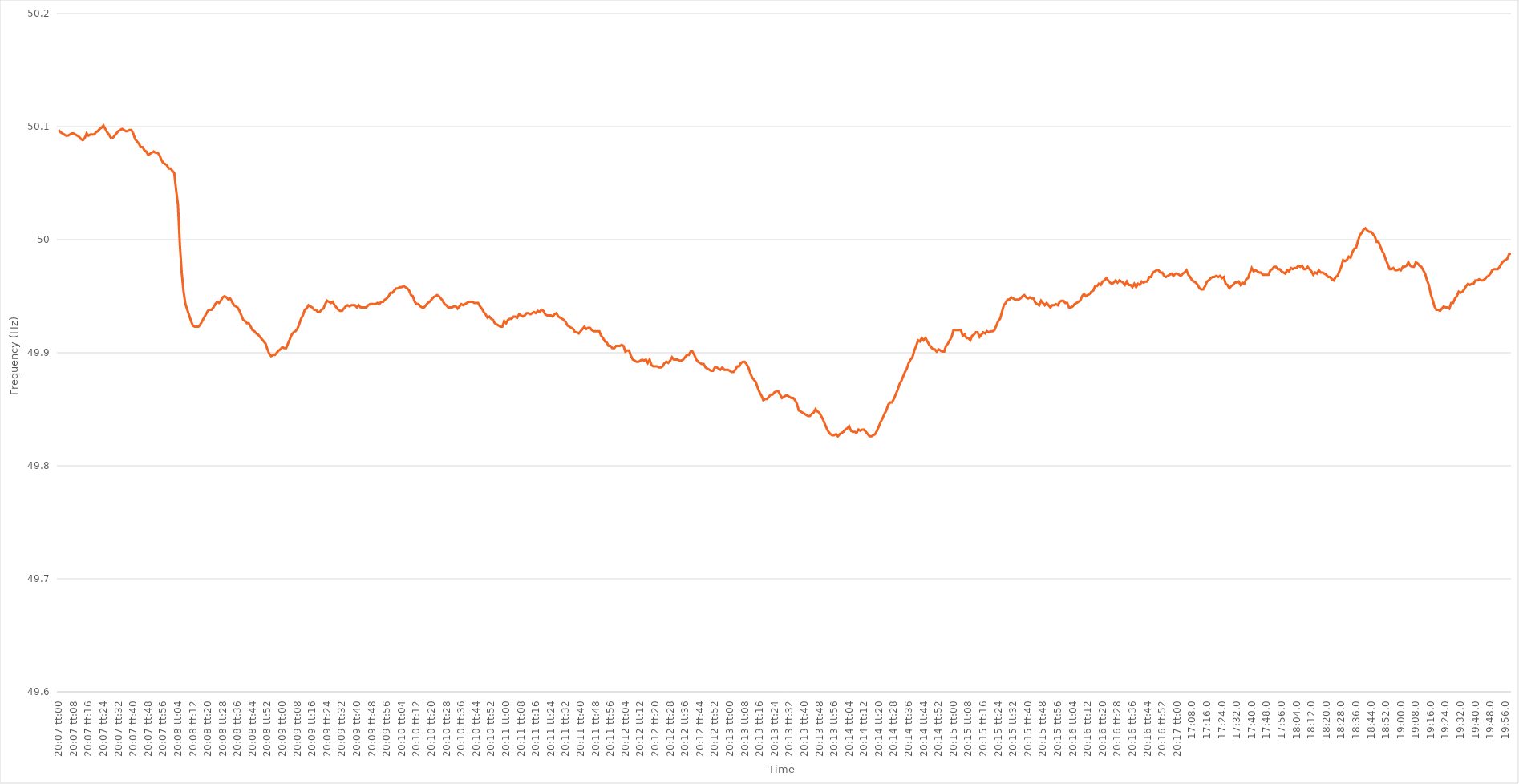
| Category | Series 0 |
|---|---|
| 0.8381944444444445 | 50.097 |
| 0.8382060185185186 | 50.095 |
| 0.8382175925925925 | 50.094 |
| 0.8382291666666667 | 50.093 |
| 0.8382407407407407 | 50.092 |
| 0.8382523148148149 | 50.092 |
| 0.8382638888888888 | 50.093 |
| 0.838275462962963 | 50.094 |
| 0.8382870370370371 | 50.094 |
| 0.8382986111111111 | 50.093 |
| 0.8383101851851852 | 50.092 |
| 0.8383217592592592 | 50.091 |
| 0.8383333333333334 | 50.089 |
| 0.8383449074074073 | 50.088 |
| 0.8383564814814815 | 50.09 |
| 0.8383680555555556 | 50.094 |
| 0.8383796296296296 | 50.092 |
| 0.8383912037037037 | 50.093 |
| 0.8384027777777777 | 50.093 |
| 0.8384143518518519 | 50.093 |
| 0.838425925925926 | 50.095 |
| 0.8384375 | 50.096 |
| 0.8384490740740741 | 50.098 |
| 0.8384606481481481 | 50.099 |
| 0.8384722222222223 | 50.101 |
| 0.8384837962962962 | 50.098 |
| 0.8384953703703704 | 50.095 |
| 0.8385069444444445 | 50.093 |
| 0.8385185185185186 | 50.09 |
| 0.8385300925925926 | 50.09 |
| 0.8385416666666666 | 50.092 |
| 0.8385532407407408 | 50.094 |
| 0.8385648148148147 | 50.096 |
| 0.8385763888888889 | 50.097 |
| 0.838587962962963 | 50.098 |
| 0.838599537037037 | 50.097 |
| 0.8386111111111111 | 50.096 |
| 0.8386226851851851 | 50.096 |
| 0.8386342592592593 | 50.097 |
| 0.8386458333333334 | 50.097 |
| 0.8386574074074074 | 50.094 |
| 0.8386689814814815 | 50.089 |
| 0.8386805555555555 | 50.087 |
| 0.8386921296296297 | 50.085 |
| 0.8387037037037036 | 50.082 |
| 0.8387152777777778 | 50.082 |
| 0.8387268518518519 | 50.079 |
| 0.838738425925926 | 50.078 |
| 0.83875 | 50.075 |
| 0.838761574074074 | 50.076 |
| 0.8387731481481482 | 50.077 |
| 0.8387847222222221 | 50.078 |
| 0.8387962962962963 | 50.077 |
| 0.8388078703703704 | 50.077 |
| 0.8388194444444445 | 50.075 |
| 0.8388310185185185 | 50.071 |
| 0.8388425925925925 | 50.068 |
| 0.8388541666666667 | 50.067 |
| 0.8388657407407408 | 50.066 |
| 0.8388773148148148 | 50.063 |
| 0.8388888888888889 | 50.063 |
| 0.838900462962963 | 50.061 |
| 0.8389120370370371 | 50.059 |
| 0.838923611111111 | 50.044 |
| 0.8389351851851852 | 50.031 |
| 0.8389467592592593 | 49.996 |
| 0.8389583333333334 | 49.971 |
| 0.8389699074074074 | 49.954 |
| 0.8389814814814814 | 49.943 |
| 0.8389930555555556 | 49.938 |
| 0.8390046296296297 | 49.933 |
| 0.8390162037037037 | 49.928 |
| 0.8390277777777778 | 49.924 |
| 0.8390393518518519 | 49.923 |
| 0.8390509259259259 | 49.923 |
| 0.8390624999999999 | 49.923 |
| 0.8390740740740741 | 49.925 |
| 0.8390856481481482 | 49.928 |
| 0.8390972222222222 | 49.931 |
| 0.8391087962962963 | 49.934 |
| 0.8391203703703703 | 49.937 |
| 0.8391319444444445 | 49.938 |
| 0.8391435185185184 | 49.938 |
| 0.8391550925925926 | 49.94 |
| 0.8391666666666667 | 49.943 |
| 0.8391782407407408 | 49.945 |
| 0.8391898148148148 | 49.944 |
| 0.8392013888888888 | 49.946 |
| 0.839212962962963 | 49.949 |
| 0.8392245370370371 | 49.95 |
| 0.8392361111111111 | 49.949 |
| 0.8392476851851852 | 49.947 |
| 0.8392592592592593 | 49.948 |
| 0.8392708333333333 | 49.945 |
| 0.8392824074074073 | 49.942 |
| 0.8392939814814815 | 49.941 |
| 0.8393055555555556 | 49.94 |
| 0.8393171296296296 | 49.937 |
| 0.8393287037037037 | 49.933 |
| 0.8393402777777778 | 49.929 |
| 0.8393518518518519 | 49.928 |
| 0.8393634259259258 | 49.926 |
| 0.839375 | 49.926 |
| 0.8393865740740741 | 49.923 |
| 0.8393981481481482 | 49.92 |
| 0.8394097222222222 | 49.919 |
| 0.8394212962962962 | 49.917 |
| 0.8394328703703704 | 49.916 |
| 0.8394444444444445 | 49.914 |
| 0.8394560185185185 | 49.912 |
| 0.8394675925925926 | 49.91 |
| 0.8394791666666667 | 49.908 |
| 0.8394907407407407 | 49.903 |
| 0.8395023148148147 | 49.899 |
| 0.8395138888888889 | 49.897 |
| 0.839525462962963 | 49.898 |
| 0.839537037037037 | 49.898 |
| 0.8395486111111111 | 49.9 |
| 0.8395601851851852 | 49.902 |
| 0.8395717592592593 | 49.903 |
| 0.8395833333333332 | 49.905 |
| 0.8395949074074074 | 49.904 |
| 0.8396064814814815 | 49.904 |
| 0.8396180555555556 | 49.908 |
| 0.8396296296296296 | 49.912 |
| 0.8396412037037037 | 49.916 |
| 0.8396527777777778 | 49.918 |
| 0.839664351851852 | 49.919 |
| 0.8396759259259259 | 49.921 |
| 0.8396875 | 49.925 |
| 0.8396990740740741 | 49.93 |
| 0.8397106481481482 | 49.933 |
| 0.8397222222222221 | 49.938 |
| 0.8397337962962963 | 49.939 |
| 0.8397453703703704 | 49.942 |
| 0.8397569444444444 | 49.941 |
| 0.8397685185185185 | 49.94 |
| 0.8397800925925926 | 49.938 |
| 0.8397916666666667 | 49.938 |
| 0.8398032407407406 | 49.936 |
| 0.8398148148148148 | 49.936 |
| 0.8398263888888889 | 49.938 |
| 0.839837962962963 | 49.939 |
| 0.839849537037037 | 49.943 |
| 0.8398611111111111 | 49.946 |
| 0.8398726851851852 | 49.945 |
| 0.8398842592592594 | 49.944 |
| 0.8398958333333333 | 49.945 |
| 0.8399074074074074 | 49.942 |
| 0.8399189814814815 | 49.94 |
| 0.8399305555555556 | 49.938 |
| 0.8399421296296296 | 49.937 |
| 0.8399537037037037 | 49.937 |
| 0.8399652777777779 | 49.939 |
| 0.8399768518518518 | 49.941 |
| 0.8399884259259259 | 49.942 |
| 0.84 | 49.941 |
| 0.8400115740740741 | 49.942 |
| 0.840023148148148 | 49.942 |
| 0.8400347222222222 | 49.942 |
| 0.8400462962962963 | 49.94 |
| 0.8400578703703704 | 49.942 |
| 0.8400694444444444 | 49.94 |
| 0.8400810185185185 | 49.94 |
| 0.8400925925925926 | 49.94 |
| 0.8401041666666668 | 49.94 |
| 0.8401157407407407 | 49.942 |
| 0.8401273148148148 | 49.943 |
| 0.8401388888888889 | 49.943 |
| 0.840150462962963 | 49.943 |
| 0.840162037037037 | 49.943 |
| 0.8401736111111111 | 49.944 |
| 0.8401851851851853 | 49.943 |
| 0.8401967592592593 | 49.945 |
| 0.8402083333333333 | 49.945 |
| 0.8402199074074074 | 49.947 |
| 0.8402314814814815 | 49.948 |
| 0.8402430555555555 | 49.95 |
| 0.8402546296296296 | 49.953 |
| 0.8402662037037038 | 49.953 |
| 0.8402777777777778 | 49.955 |
| 0.8402893518518518 | 49.957 |
| 0.8403009259259259 | 49.957 |
| 0.8403125 | 49.958 |
| 0.8403240740740742 | 49.958 |
| 0.8403356481481481 | 49.959 |
| 0.8403472222222222 | 49.958 |
| 0.8403587962962963 | 49.957 |
| 0.8403703703703704 | 49.955 |
| 0.8403819444444444 | 49.951 |
| 0.8403935185185185 | 49.95 |
| 0.8404050925925927 | 49.945 |
| 0.8404166666666667 | 49.943 |
| 0.8404282407407407 | 49.943 |
| 0.8404398148148148 | 49.941 |
| 0.8404513888888889 | 49.94 |
| 0.8404629629629629 | 49.94 |
| 0.840474537037037 | 49.942 |
| 0.8404861111111112 | 49.944 |
| 0.8404976851851852 | 49.945 |
| 0.8405092592592592 | 49.947 |
| 0.8405208333333333 | 49.949 |
| 0.8405324074074074 | 49.95 |
| 0.8405439814814816 | 49.951 |
| 0.8405555555555555 | 49.95 |
| 0.8405671296296297 | 49.948 |
| 0.8405787037037037 | 49.946 |
| 0.8405902777777778 | 49.943 |
| 0.8406018518518518 | 49.942 |
| 0.8406134259259259 | 49.94 |
| 0.8406250000000001 | 49.94 |
| 0.8406365740740741 | 49.94 |
| 0.8406481481481481 | 49.941 |
| 0.8406597222222222 | 49.941 |
| 0.8406712962962963 | 49.939 |
| 0.8406828703703703 | 49.941 |
| 0.8406944444444444 | 49.943 |
| 0.8407060185185186 | 49.942 |
| 0.8407175925925926 | 49.943 |
| 0.8407291666666666 | 49.944 |
| 0.8407407407407407 | 49.945 |
| 0.8407523148148148 | 49.945 |
| 0.840763888888889 | 49.945 |
| 0.8407754629629629 | 49.944 |
| 0.840787037037037 | 49.944 |
| 0.8407986111111111 | 49.944 |
| 0.8408101851851852 | 49.941 |
| 0.8408217592592592 | 49.939 |
| 0.8408333333333333 | 49.936 |
| 0.8408449074074075 | 49.934 |
| 0.8408564814814815 | 49.931 |
| 0.8408680555555555 | 49.932 |
| 0.8408796296296296 | 49.93 |
| 0.8408912037037037 | 49.929 |
| 0.8409027777777779 | 49.926 |
| 0.8409143518518518 | 49.925 |
| 0.840925925925926 | 49.924 |
| 0.8409375 | 49.923 |
| 0.840949074074074 | 49.923 |
| 0.8409606481481481 | 49.928 |
| 0.8409722222222222 | 49.926 |
| 0.8409837962962964 | 49.929 |
| 0.8409953703703703 | 49.93 |
| 0.8410069444444445 | 49.93 |
| 0.8410185185185185 | 49.932 |
| 0.8410300925925926 | 49.932 |
| 0.8410416666666666 | 49.931 |
| 0.8410532407407407 | 49.934 |
| 0.8410648148148149 | 49.933 |
| 0.8410763888888889 | 49.932 |
| 0.841087962962963 | 49.933 |
| 0.841099537037037 | 49.935 |
| 0.8411111111111111 | 49.935 |
| 0.8411226851851853 | 49.934 |
| 0.8411342592592592 | 49.935 |
| 0.8411458333333334 | 49.936 |
| 0.8411574074074074 | 49.935 |
| 0.8411689814814814 | 49.937 |
| 0.8411805555555555 | 49.936 |
| 0.8411921296296296 | 49.938 |
| 0.8412037037037038 | 49.937 |
| 0.8412152777777777 | 49.934 |
| 0.8412268518518519 | 49.933 |
| 0.8412384259259259 | 49.933 |
| 0.84125 | 49.933 |
| 0.841261574074074 | 49.932 |
| 0.8412731481481481 | 49.934 |
| 0.8412847222222223 | 49.935 |
| 0.8412962962962963 | 49.932 |
| 0.8413078703703704 | 49.931 |
| 0.8413194444444444 | 49.93 |
| 0.8413310185185185 | 49.929 |
| 0.8413425925925927 | 49.927 |
| 0.8413541666666666 | 49.924 |
| 0.8413657407407408 | 49.923 |
| 0.8413773148148148 | 49.922 |
| 0.8413888888888889 | 49.921 |
| 0.8414004629629629 | 49.918 |
| 0.841412037037037 | 49.918 |
| 0.8414236111111112 | 49.917 |
| 0.8414351851851851 | 49.919 |
| 0.8414467592592593 | 49.921 |
| 0.8414583333333333 | 49.923 |
| 0.8414699074074075 | 49.921 |
| 0.8414814814814814 | 49.922 |
| 0.8414930555555555 | 49.922 |
| 0.8415046296296297 | 49.92 |
| 0.8415162037037037 | 49.919 |
| 0.8415277777777778 | 49.919 |
| 0.8415393518518518 | 49.919 |
| 0.841550925925926 | 49.919 |
| 0.8415625000000001 | 49.915 |
| 0.841574074074074 | 49.913 |
| 0.8415856481481482 | 49.91 |
| 0.8415972222222222 | 49.909 |
| 0.8416087962962964 | 49.906 |
| 0.8416203703703703 | 49.906 |
| 0.8416319444444444 | 49.904 |
| 0.8416435185185186 | 49.904 |
| 0.8416550925925925 | 49.906 |
| 0.8416666666666667 | 49.906 |
| 0.8416782407407407 | 49.906 |
| 0.8416898148148149 | 49.907 |
| 0.8417013888888888 | 49.906 |
| 0.8417129629629629 | 49.901 |
| 0.8417245370370371 | 49.902 |
| 0.8417361111111111 | 49.902 |
| 0.8417476851851852 | 49.897 |
| 0.8417592592592592 | 49.894 |
| 0.8417708333333334 | 49.893 |
| 0.8417824074074075 | 49.892 |
| 0.8417939814814814 | 49.892 |
| 0.8418055555555556 | 49.893 |
| 0.8418171296296296 | 49.894 |
| 0.8418287037037038 | 49.893 |
| 0.8418402777777777 | 49.894 |
| 0.8418518518518519 | 49.891 |
| 0.841863425925926 | 49.894 |
| 0.8418749999999999 | 49.889 |
| 0.8418865740740741 | 49.888 |
| 0.8418981481481481 | 49.888 |
| 0.8419097222222223 | 49.888 |
| 0.8419212962962962 | 49.887 |
| 0.8419328703703703 | 49.887 |
| 0.8419444444444445 | 49.888 |
| 0.8419560185185185 | 49.891 |
| 0.8419675925925926 | 49.892 |
| 0.8419791666666666 | 49.891 |
| 0.8419907407407408 | 49.893 |
| 0.8420023148148149 | 49.896 |
| 0.8420138888888888 | 49.894 |
| 0.842025462962963 | 49.894 |
| 0.842037037037037 | 49.894 |
| 0.8420486111111112 | 49.893 |
| 0.8420601851851851 | 49.893 |
| 0.8420717592592593 | 49.894 |
| 0.8420833333333334 | 49.896 |
| 0.8420949074074073 | 49.898 |
| 0.8421064814814815 | 49.898 |
| 0.8421180555555555 | 49.901 |
| 0.8421296296296297 | 49.901 |
| 0.8421412037037036 | 49.898 |
| 0.8421527777777778 | 49.894 |
| 0.8421643518518519 | 49.892 |
| 0.8421759259259259 | 49.891 |
| 0.8421875 | 49.89 |
| 0.842199074074074 | 49.89 |
| 0.8422106481481482 | 49.887 |
| 0.8422222222222223 | 49.886 |
| 0.8422337962962962 | 49.885 |
| 0.8422453703703704 | 49.884 |
| 0.8422569444444444 | 49.884 |
| 0.8422685185185186 | 49.887 |
| 0.8422800925925925 | 49.887 |
| 0.8422916666666667 | 49.886 |
| 0.8423032407407408 | 49.885 |
| 0.8423148148148148 | 49.887 |
| 0.8423263888888889 | 49.885 |
| 0.8423379629629629 | 49.885 |
| 0.8423495370370371 | 49.885 |
| 0.842361111111111 | 49.884 |
| 0.8423726851851852 | 49.883 |
| 0.8423842592592593 | 49.883 |
| 0.8423958333333333 | 49.885 |
| 0.8424074074074074 | 49.888 |
| 0.8424189814814814 | 49.888 |
| 0.8424305555555556 | 49.891 |
| 0.8424421296296297 | 49.892 |
| 0.8424537037037036 | 49.892 |
| 0.8424652777777778 | 49.89 |
| 0.8424768518518518 | 49.887 |
| 0.842488425925926 | 49.882 |
| 0.8424999999999999 | 49.878 |
| 0.8425115740740741 | 49.876 |
| 0.8425231481481482 | 49.874 |
| 0.8425347222222223 | 49.869 |
| 0.8425462962962963 | 49.865 |
| 0.8425578703703703 | 49.862 |
| 0.8425694444444445 | 49.858 |
| 0.8425810185185184 | 49.859 |
| 0.8425925925925926 | 49.859 |
| 0.8426041666666667 | 49.861 |
| 0.8426157407407407 | 49.863 |
| 0.8426273148148148 | 49.863 |
| 0.8426388888888888 | 49.865 |
| 0.842650462962963 | 49.866 |
| 0.8426620370370371 | 49.866 |
| 0.842673611111111 | 49.863 |
| 0.8426851851851852 | 49.86 |
| 0.8426967592592592 | 49.861 |
| 0.8427083333333334 | 49.862 |
| 0.8427199074074073 | 49.862 |
| 0.8427314814814815 | 49.861 |
| 0.8427430555555556 | 49.86 |
| 0.8427546296296297 | 49.86 |
| 0.8427662037037037 | 49.858 |
| 0.8427777777777777 | 49.855 |
| 0.8427893518518519 | 49.849 |
| 0.842800925925926 | 49.848 |
| 0.8428125 | 49.847 |
| 0.8428240740740741 | 49.846 |
| 0.8428356481481482 | 49.845 |
| 0.8428472222222222 | 49.844 |
| 0.8428587962962962 | 49.844 |
| 0.8428703703703704 | 49.846 |
| 0.8428819444444445 | 49.847 |
| 0.8428935185185185 | 49.85 |
| 0.8429050925925926 | 49.848 |
| 0.8429166666666666 | 49.847 |
| 0.8429282407407408 | 49.844 |
| 0.8429398148148147 | 49.841 |
| 0.8429513888888889 | 49.837 |
| 0.842962962962963 | 49.833 |
| 0.8429745370370371 | 49.83 |
| 0.8429861111111111 | 49.828 |
| 0.8429976851851851 | 49.827 |
| 0.8430092592592593 | 49.827 |
| 0.8430208333333334 | 49.828 |
| 0.8430324074074074 | 49.826 |
| 0.8430439814814815 | 49.828 |
| 0.8430555555555556 | 49.829 |
| 0.8430671296296296 | 49.83 |
| 0.8430787037037036 | 49.832 |
| 0.8430902777777778 | 49.833 |
| 0.8431018518518519 | 49.835 |
| 0.8431134259259259 | 49.831 |
| 0.843125 | 49.83 |
| 0.843136574074074 | 49.83 |
| 0.8431481481481482 | 49.829 |
| 0.8431597222222221 | 49.832 |
| 0.8431712962962963 | 49.831 |
| 0.8431828703703704 | 49.832 |
| 0.8431944444444445 | 49.832 |
| 0.8432060185185185 | 49.83 |
| 0.8432175925925925 | 49.828 |
| 0.8432291666666667 | 49.826 |
| 0.8432407407407408 | 49.826 |
| 0.8432523148148148 | 49.827 |
| 0.8432638888888889 | 49.828 |
| 0.843275462962963 | 49.831 |
| 0.843287037037037 | 49.835 |
| 0.843298611111111 | 49.839 |
| 0.8433101851851852 | 49.842 |
| 0.8433217592592593 | 49.846 |
| 0.8433333333333333 | 49.849 |
| 0.8433449074074074 | 49.854 |
| 0.8433564814814815 | 49.856 |
| 0.8433680555555556 | 49.856 |
| 0.8433796296296295 | 49.859 |
| 0.8433912037037037 | 49.863 |
| 0.8434027777777778 | 49.867 |
| 0.8434143518518519 | 49.872 |
| 0.8434259259259259 | 49.875 |
| 0.8434375 | 49.879 |
| 0.8434490740740741 | 49.883 |
| 0.8434606481481483 | 49.886 |
| 0.8434722222222222 | 49.891 |
| 0.8434837962962963 | 49.894 |
| 0.8434953703703704 | 49.896 |
| 0.8435069444444445 | 49.902 |
| 0.8435185185185184 | 49.906 |
| 0.8435300925925926 | 49.911 |
| 0.8435416666666667 | 49.91 |
| 0.8435532407407407 | 49.913 |
| 0.8435648148148148 | 49.911 |
| 0.8435763888888889 | 49.913 |
| 0.843587962962963 | 49.91 |
| 0.8435995370370369 | 49.907 |
| 0.8436111111111111 | 49.905 |
| 0.8436226851851852 | 49.903 |
| 0.8436342592592593 | 49.903 |
| 0.8436458333333333 | 49.901 |
| 0.8436574074074074 | 49.903 |
| 0.8436689814814815 | 49.902 |
| 0.8436805555555557 | 49.901 |
| 0.8436921296296296 | 49.901 |
| 0.8437037037037037 | 49.906 |
| 0.8437152777777778 | 49.908 |
| 0.8437268518518519 | 49.911 |
| 0.8437384259259259 | 49.914 |
| 0.84375 | 49.92 |
| 0.8437615740740741 | 49.92 |
| 0.8437731481481481 | 49.92 |
| 0.8437847222222222 | 49.92 |
| 0.8437962962962963 | 49.92 |
| 0.8438078703703704 | 49.915 |
| 0.8438194444444443 | 49.916 |
| 0.8438310185185185 | 49.913 |
| 0.8438425925925926 | 49.913 |
| 0.8438541666666667 | 49.911 |
| 0.8438657407407407 | 49.915 |
| 0.8438773148148148 | 49.916 |
| 0.8438888888888889 | 49.918 |
| 0.8439004629629631 | 49.918 |
| 0.843912037037037 | 49.914 |
| 0.8439236111111111 | 49.916 |
| 0.8439351851851852 | 49.918 |
| 0.8439467592592593 | 49.917 |
| 0.8439583333333333 | 49.919 |
| 0.8439699074074074 | 49.918 |
| 0.8439814814814816 | 49.919 |
| 0.8439930555555555 | 49.919 |
| 0.8440046296296296 | 49.92 |
| 0.8440162037037037 | 49.924 |
| 0.8440277777777778 | 49.928 |
| 0.8440393518518517 | 49.93 |
| 0.8440509259259259 | 49.936 |
| 0.8440625 | 49.942 |
| 0.8440740740740741 | 49.944 |
| 0.8440856481481481 | 49.947 |
| 0.8440972222222222 | 49.947 |
| 0.8441087962962963 | 49.949 |
| 0.8441203703703705 | 49.948 |
| 0.8441319444444444 | 49.947 |
| 0.8441435185185185 | 49.947 |
| 0.8441550925925926 | 49.947 |
| 0.8441666666666667 | 49.948 |
| 0.8441782407407407 | 49.95 |
| 0.8441898148148148 | 49.951 |
| 0.844201388888889 | 49.949 |
| 0.844212962962963 | 49.948 |
| 0.844224537037037 | 49.949 |
| 0.8442361111111111 | 49.948 |
| 0.8442476851851852 | 49.948 |
| 0.8442592592592592 | 49.944 |
| 0.8442708333333333 | 49.943 |
| 0.8442824074074075 | 49.942 |
| 0.8442939814814815 | 49.946 |
| 0.8443055555555555 | 49.944 |
| 0.8443171296296296 | 49.942 |
| 0.8443287037037037 | 49.944 |
| 0.8443402777777779 | 49.942 |
| 0.8443518518518518 | 49.94 |
| 0.844363425925926 | 49.942 |
| 0.844375 | 49.942 |
| 0.8443865740740741 | 49.943 |
| 0.8443981481481481 | 49.942 |
| 0.8444097222222222 | 49.945 |
| 0.8444212962962964 | 49.946 |
| 0.8444328703703704 | 49.946 |
| 0.8444444444444444 | 49.944 |
| 0.8444560185185185 | 49.944 |
| 0.8444675925925926 | 49.94 |
| 0.8444791666666666 | 49.94 |
| 0.8444907407407407 | 49.941 |
| 0.8445023148148149 | 49.943 |
| 0.8445138888888889 | 49.944 |
| 0.8445254629629629 | 49.945 |
| 0.844537037037037 | 49.946 |
| 0.8445486111111111 | 49.95 |
| 0.8445601851851853 | 49.952 |
| 0.8445717592592592 | 49.95 |
| 0.8445833333333334 | 49.951 |
| 0.8445949074074074 | 49.952 |
| 0.8446064814814815 | 49.954 |
| 0.8446180555555555 | 49.955 |
| 0.8446296296296296 | 49.959 |
| 0.8446412037037038 | 49.959 |
| 0.8446527777777778 | 49.961 |
| 0.8446643518518518 | 49.96 |
| 0.8446759259259259 | 49.963 |
| 0.8446875 | 49.964 |
| 0.844699074074074 | 49.966 |
| 0.8447106481481481 | 49.964 |
| 0.8447222222222223 | 49.962 |
| 0.8447337962962963 | 49.961 |
| 0.8447453703703703 | 49.962 |
| 0.8447569444444444 | 49.964 |
| 0.8447685185185185 | 49.962 |
| 0.8447800925925927 | 49.964 |
| 0.8447916666666666 | 49.963 |
| 0.8448032407407408 | 49.962 |
| 0.8448148148148148 | 49.96 |
| 0.844826388888889 | 49.963 |
| 0.8448379629629629 | 49.96 |
| 0.844849537037037 | 49.96 |
| 0.8448611111111112 | 49.958 |
| 0.8448726851851852 | 49.961 |
| 0.8448842592592593 | 49.958 |
| 0.8448958333333333 | 49.961 |
| 0.8449074074074074 | 49.96 |
| 0.8449189814814816 | 49.963 |
| 0.8449305555555555 | 49.962 |
| 0.8449421296296297 | 49.963 |
| 0.8449537037037037 | 49.963 |
| 0.8449652777777777 | 49.967 |
| 0.8449768518518518 | 49.967 |
| 0.8449884259259259 | 49.971 |
| 0.8450000000000001 | 49.972 |
| 0.845011574074074 | 49.973 |
| 0.8450231481481482 | 49.973 |
| 0.8450347222222222 | 49.971 |
| 0.8450462962962964 | 49.971 |
| 0.8450578703703703 | 49.968 |
| 0.8450694444444444 | 49.967 |
| 0.8450810185185186 | 49.968 |
| 0.8450925925925926 | 49.969 |
| 0.8451041666666667 | 49.97 |
| 0.8451157407407407 | 49.968 |
| 0.8451273148148148 | 49.97 |
| 0.845138888888889 | 49.97 |
| 0.8451504629629629 | 49.969 |
| 0.8451620370370371 | 49.968 |
| 0.8451736111111111 | 49.97 |
| 0.8451851851851852 | 49.971 |
| 0.8451967592592592 | 49.973 |
| 0.8452083333333333 | 49.969 |
| 0.8452199074074075 | 49.967 |
| 0.8452314814814814 | 49.964 |
| 0.8452430555555556 | 49.963 |
| 0.8452546296296296 | 49.962 |
| 0.8452662037037038 | 49.96 |
| 0.8452777777777777 | 49.957 |
| 0.8452893518518518 | 49.956 |
| 0.845300925925926 | 49.956 |
| 0.8453125 | 49.959 |
| 0.8453240740740741 | 49.963 |
| 0.8453356481481481 | 49.964 |
| 0.8453472222222222 | 49.966 |
| 0.8453587962962964 | 49.967 |
| 0.8453703703703703 | 49.967 |
| 0.8453819444444445 | 49.968 |
| 0.8453935185185185 | 49.967 |
| 0.8454050925925927 | 49.968 |
| 0.8454166666666666 | 49.966 |
| 0.8454282407407407 | 49.967 |
| 0.8454398148148149 | 49.961 |
| 0.8454513888888888 | 49.96 |
| 0.845462962962963 | 49.957 |
| 0.845474537037037 | 49.959 |
| 0.8454861111111112 | 49.96 |
| 0.8454976851851851 | 49.962 |
| 0.8455092592592592 | 49.962 |
| 0.8455208333333334 | 49.963 |
| 0.8455324074074074 | 49.96 |
| 0.8455439814814815 | 49.962 |
| 0.8455555555555555 | 49.961 |
| 0.8455671296296297 | 49.965 |
| 0.8455787037037038 | 49.966 |
| 0.8455902777777777 | 49.971 |
| 0.8456018518518519 | 49.975 |
| 0.8456134259259259 | 49.972 |
| 0.8456250000000001 | 49.973 |
| 0.845636574074074 | 49.972 |
| 0.8456481481481481 | 49.971 |
| 0.8456597222222223 | 49.971 |
| 0.8456712962962962 | 49.969 |
| 0.8456828703703704 | 49.969 |
| 0.8456944444444444 | 49.969 |
| 0.8457060185185186 | 49.969 |
| 0.8457175925925925 | 49.973 |
| 0.8457291666666666 | 49.974 |
| 0.8457407407407408 | 49.976 |
| 0.8457523148148148 | 49.976 |
| 0.8457638888888889 | 49.974 |
| 0.8457754629629629 | 49.974 |
| 0.8457870370370371 | 49.972 |
| 0.8457986111111112 | 49.971 |
| 0.8458101851851851 | 49.97 |
| 0.8458217592592593 | 49.973 |
| 0.8458333333333333 | 49.972 |
| 0.8458449074074075 | 49.975 |
| 0.8458564814814814 | 49.974 |
| 0.8458680555555556 | 49.975 |
| 0.8458796296296297 | 49.975 |
| 0.8458912037037036 | 49.977 |
| 0.8459027777777778 | 49.976 |
| 0.8459143518518518 | 49.977 |
| 0.845925925925926 | 49.974 |
| 0.8459374999999999 | 49.974 |
| 0.845949074074074 | 49.976 |
| 0.8459606481481482 | 49.974 |
| 0.8459722222222222 | 49.972 |
| 0.8459837962962963 | 49.969 |
| 0.8459953703703703 | 49.971 |
| 0.8460069444444445 | 49.97 |
| 0.8460185185185186 | 49.973 |
| 0.8460300925925925 | 49.971 |
| 0.8460416666666667 | 49.971 |
| 0.8460532407407407 | 49.97 |
| 0.8460648148148149 | 49.969 |
| 0.8460763888888888 | 49.967 |
| 0.846087962962963 | 49.967 |
| 0.8460995370370371 | 49.965 |
| 0.846111111111111 | 49.964 |
| 0.8461226851851852 | 49.967 |
| 0.8461342592592592 | 49.968 |
| 0.8461458333333334 | 49.972 |
| 0.8461574074074073 | 49.976 |
| 0.8461689814814815 | 49.982 |
| 0.8461805555555556 | 49.981 |
| 0.8461921296296296 | 49.982 |
| 0.8462037037037037 | 49.985 |
| 0.8462152777777777 | 49.984 |
| 0.8462268518518519 | 49.989 |
| 0.846238425925926 | 49.992 |
| 0.84625 | 49.993 |
| 0.8462615740740741 | 49.999 |
| 0.8462731481481481 | 50.004 |
| 0.8462847222222223 | 50.006 |
| 0.8462962962962962 | 50.009 |
| 0.8463078703703704 | 50.01 |
| 0.8463194444444445 | 50.008 |
| 0.8463310185185186 | 50.007 |
| 0.8463425925925926 | 50.007 |
| 0.8463541666666666 | 50.005 |
| 0.8463657407407408 | 50.003 |
| 0.8463773148148147 | 49.998 |
| 0.8463888888888889 | 49.998 |
| 0.846400462962963 | 49.994 |
| 0.846412037037037 | 49.99 |
| 0.8464236111111111 | 49.987 |
| 0.8464351851851851 | 49.982 |
| 0.8464467592592593 | 49.978 |
| 0.8464583333333334 | 49.974 |
| 0.8464699074074074 | 49.974 |
| 0.8464814814814815 | 49.975 |
| 0.8464930555555555 | 49.973 |
| 0.8465046296296297 | 49.973 |
| 0.8465162037037036 | 49.974 |
| 0.8465277777777778 | 49.973 |
| 0.8465393518518519 | 49.976 |
| 0.846550925925926 | 49.976 |
| 0.8465625 | 49.977 |
| 0.846574074074074 | 49.98 |
| 0.8465856481481482 | 49.977 |
| 0.8465972222222223 | 49.976 |
| 0.8466087962962963 | 49.976 |
| 0.8466203703703704 | 49.98 |
| 0.8466319444444445 | 49.979 |
| 0.8466435185185185 | 49.977 |
| 0.8466550925925925 | 49.976 |
| 0.8466666666666667 | 49.973 |
| 0.8466782407407408 | 49.97 |
| 0.8466898148148148 | 49.964 |
| 0.8467013888888889 | 49.96 |
| 0.846712962962963 | 49.952 |
| 0.8467245370370371 | 49.947 |
| 0.846736111111111 | 49.941 |
| 0.8467476851851852 | 49.938 |
| 0.8467592592592593 | 49.938 |
| 0.8467708333333334 | 49.937 |
| 0.8467824074074074 | 49.939 |
| 0.8467939814814814 | 49.941 |
| 0.8468055555555556 | 49.94 |
| 0.8468171296296297 | 49.94 |
| 0.8468287037037037 | 49.939 |
| 0.8468402777777778 | 49.944 |
| 0.8468518518518519 | 49.944 |
| 0.8468634259259259 | 49.948 |
| 0.8468749999999999 | 49.95 |
| 0.8468865740740741 | 49.954 |
| 0.8468981481481482 | 49.953 |
| 0.8469097222222222 | 49.954 |
| 0.8469212962962963 | 49.956 |
| 0.8469328703703703 | 49.959 |
| 0.8469444444444445 | 49.961 |
| 0.8469560185185184 | 49.96 |
| 0.8469675925925926 | 49.961 |
| 0.8469791666666667 | 49.961 |
| 0.8469907407407408 | 49.964 |
| 0.8470023148148148 | 49.964 |
| 0.8470138888888888 | 49.965 |
| 0.847025462962963 | 49.964 |
| 0.8470370370370371 | 49.964 |
| 0.8470486111111111 | 49.965 |
| 0.8470601851851852 | 49.967 |
| 0.8470717592592593 | 49.968 |
| 0.8470833333333333 | 49.97 |
| 0.8470949074074073 | 49.973 |
| 0.8471064814814815 | 49.974 |
| 0.8471180555555556 | 49.974 |
| 0.8471296296296296 | 49.974 |
| 0.8471412037037037 | 49.976 |
| 0.8471527777777778 | 49.979 |
| 0.8471643518518519 | 49.981 |
| 0.8471759259259258 | 49.982 |
| 0.8471875 | 49.983 |
| 0.8471990740740741 | 49.987 |
| 0.8472106481481482 | 49.988 |